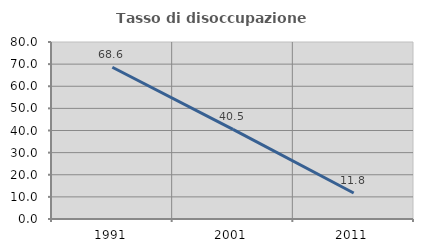
| Category | Tasso di disoccupazione giovanile  |
|---|---|
| 1991.0 | 68.595 |
| 2001.0 | 40.476 |
| 2011.0 | 11.765 |